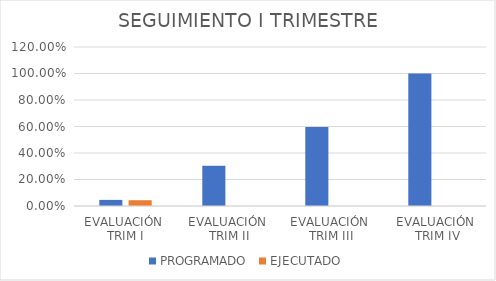
| Category | PROGRAMADO | EJECUTADO |
|---|---|---|
| EVALUACIÓN 
TRIM I | 0.046 | 0.044 |
| EVALUACIÓN 
TRIM II | 0.304 | 0 |
| EVALUACIÓN 
TRIM III | 0.596 | 0 |
| EVALUACIÓN
 TRIM IV | 1 | 0 |